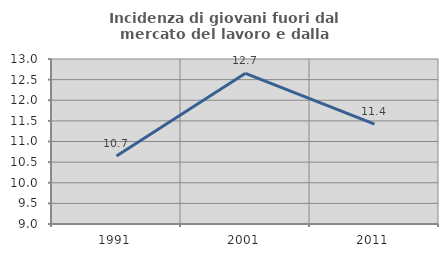
| Category | Incidenza di giovani fuori dal mercato del lavoro e dalla formazione  |
|---|---|
| 1991.0 | 10.651 |
| 2001.0 | 12.652 |
| 2011.0 | 11.42 |